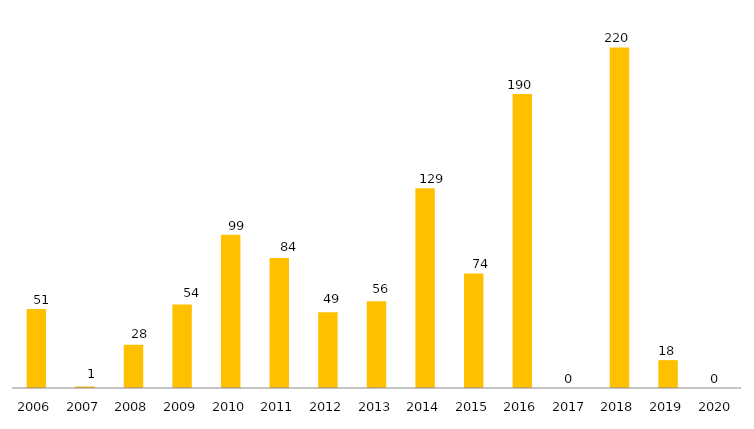
| Category | Especialização |
|---|---|
| 2006.0 | 51 |
| 2007.0 | 1 |
| 2008.0 | 28 |
| 2009.0 | 54 |
| 2010.0 | 99 |
| 2011.0 | 84 |
| 2012.0 | 49 |
| 2013.0 | 56 |
| 2014.0 | 129 |
| 2015.0 | 74 |
| 2016.0 | 190 |
| 2017.0 | 0 |
| 2018.0 | 220 |
| 2019.0 | 18 |
| 2020.0 | 0 |